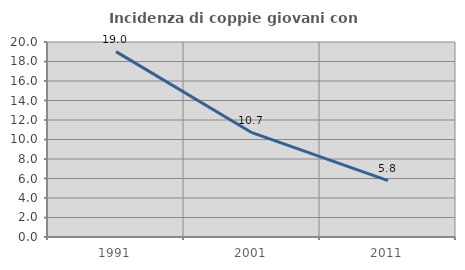
| Category | Incidenza di coppie giovani con figli |
|---|---|
| 1991.0 | 19.013 |
| 2001.0 | 10.7 |
| 2011.0 | 5.775 |